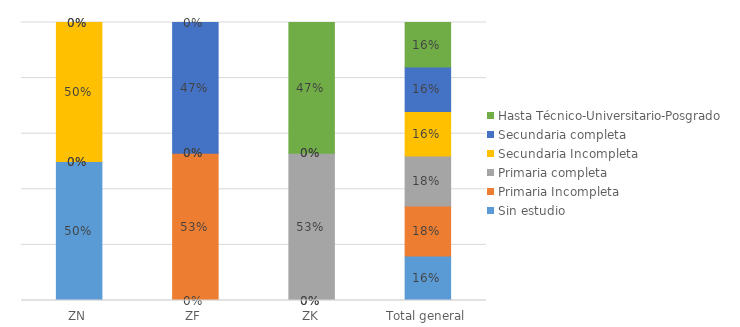
| Category | Sin estudio | Primaria Incompleta | Primaria completa | Secundaria Incompleta | Secundaria completa | Hasta Técnico-Universitario-Posgrado |
|---|---|---|---|---|---|---|
| ZN | 0.5 | 0 | 0 | 0.5 | 0 | 0 |
| ZF | 0 | 0.529 | 0 | 0 | 0.471 | 0 |
| ZK | 0 | 0 | 0.529 | 0 | 0 | 0.471 |
| Total general | 0.16 | 0.18 | 0.18 | 0.16 | 0.16 | 0.16 |